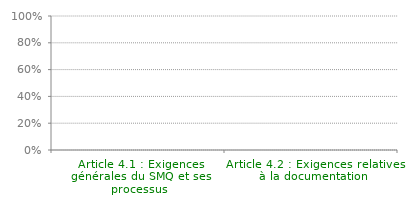
| Category | Article 4 |
|---|---|
| Article 4.1 : Exigences générales du SMQ et ses processus | 0 |
| Article 4.2 : Exigences relatives à la documentation | 0 |